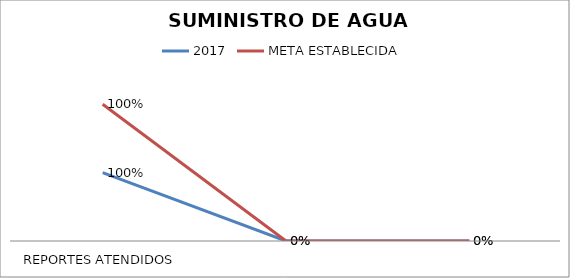
| Category | 2017 | META ESTABLECIDA |
|---|---|---|
| REPORTES ATENDIDOS | 1 | 1 |